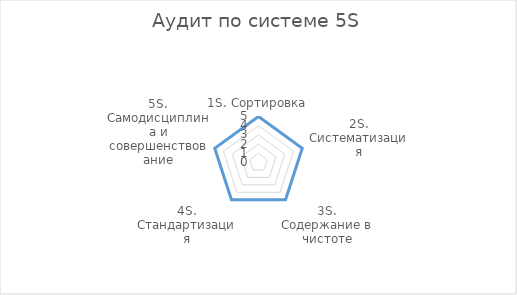
| Category | Series 0 | Series 1 |
|---|---|---|
| 1S. Сортировка | 5 | 0 |
| 2S. Систематизация | 5 | 0 |
| 3S. Содержание в чистоте | 5 | 0 |
| 4S. Стандартизация | 5 | 0 |
| 5S. Самодисциплина и совершенствование | 5 | 0 |